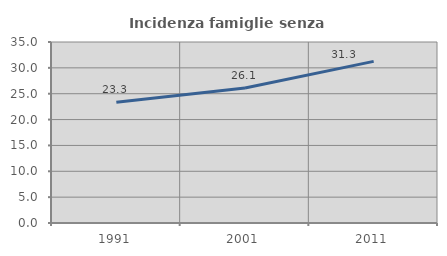
| Category | Incidenza famiglie senza nuclei |
|---|---|
| 1991.0 | 23.34 |
| 2001.0 | 26.087 |
| 2011.0 | 31.25 |